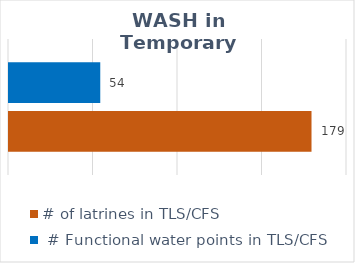
| Category | # of latrines in TLS/CFS |  # Functional water points in TLS/CFS |
|---|---|---|
| Central Rakhine | 179 | 54 |